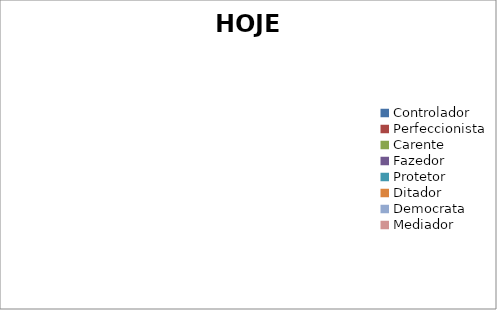
| Category | HOJE |
|---|---|
| Controlador | 0 |
| Perfeccionista | 0 |
| Carente | 0 |
| Fazedor | 0 |
| Protetor | 0 |
| Ditador | 0 |
| Democrata | 0 |
| Mediador | 0 |